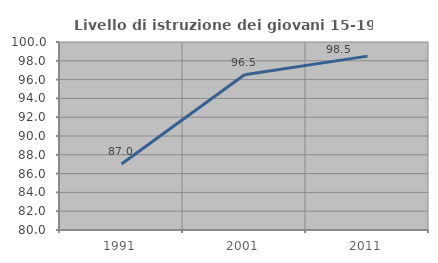
| Category | Livello di istruzione dei giovani 15-19 anni |
|---|---|
| 1991.0 | 87.017 |
| 2001.0 | 96.524 |
| 2011.0 | 98.498 |